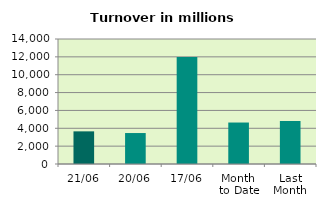
| Category | Series 0 |
|---|---|
| 21/06 | 3656.19 |
| 20/06 | 3468.367 |
| 17/06 | 11997.403 |
| Month 
to Date | 4645.104 |
| Last
Month | 4818.103 |